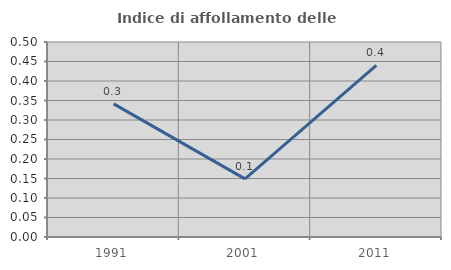
| Category | Indice di affollamento delle abitazioni  |
|---|---|
| 1991.0 | 0.341 |
| 2001.0 | 0.149 |
| 2011.0 | 0.44 |